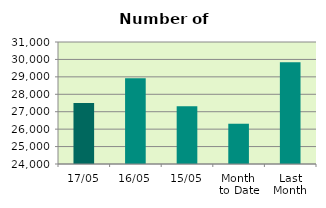
| Category | Series 0 |
|---|---|
| 17/05 | 27494 |
| 16/05 | 28924 |
| 15/05 | 27312 |
| Month 
to Date | 26310.333 |
| Last
Month | 29833 |